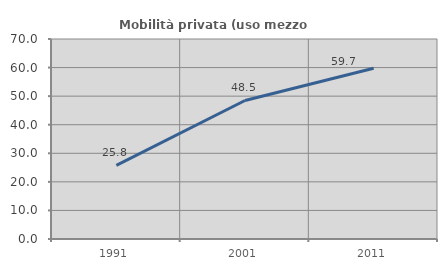
| Category | Mobilità privata (uso mezzo privato) |
|---|---|
| 1991.0 | 25.764 |
| 2001.0 | 48.485 |
| 2011.0 | 59.74 |